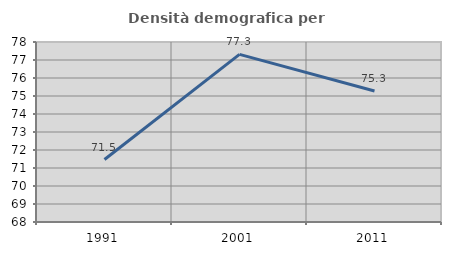
| Category | Densità demografica |
|---|---|
| 1991.0 | 71.472 |
| 2001.0 | 77.313 |
| 2011.0 | 75.279 |